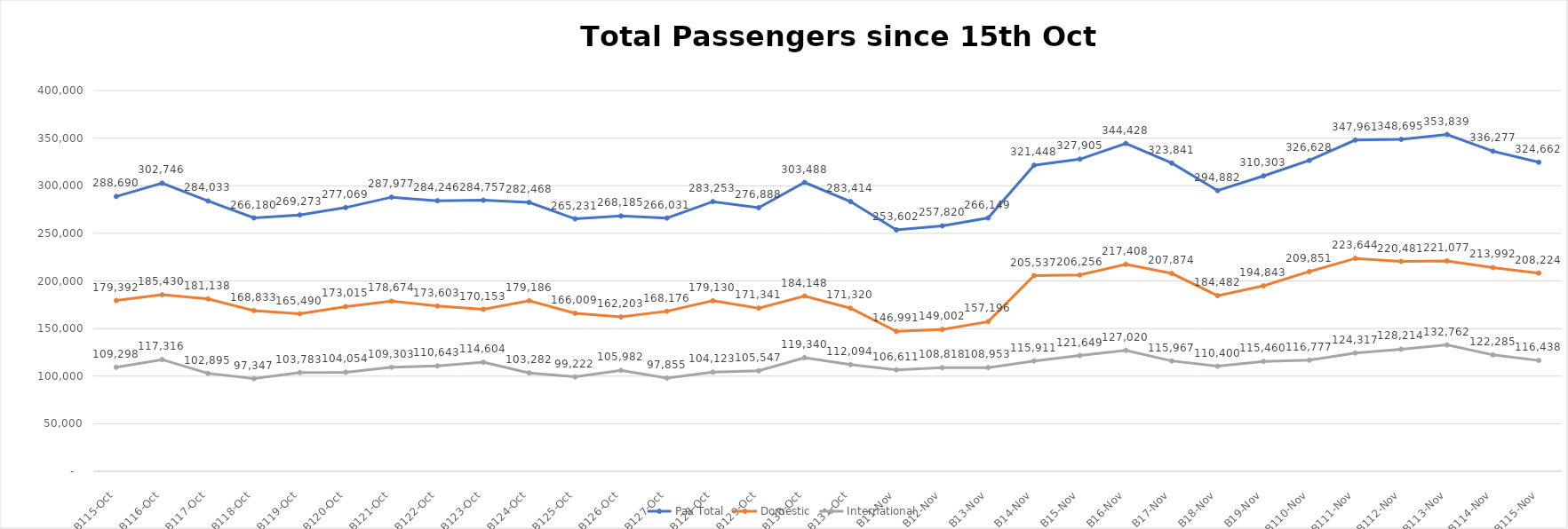
| Category | Pax Total |  Domestic  |  International  |
|---|---|---|---|
| 2022-10-15 | 288690 | 179392 | 109298 |
| 2022-10-16 | 302746 | 185430 | 117316 |
| 2022-10-17 | 284033 | 181138 | 102895 |
| 2022-10-18 | 266180 | 168833 | 97347 |
| 2022-10-19 | 269273 | 165490 | 103783 |
| 2022-10-20 | 277069 | 173015 | 104054 |
| 2022-10-21 | 287977 | 178674 | 109303 |
| 2022-10-22 | 284246 | 173603 | 110643 |
| 2022-10-23 | 284757 | 170153 | 114604 |
| 2022-10-24 | 282468 | 179186 | 103282 |
| 2022-10-25 | 265231 | 166009 | 99222 |
| 2022-10-26 | 268185 | 162203 | 105982 |
| 2022-10-27 | 266031 | 168176 | 97855 |
| 2022-10-28 | 283253 | 179130 | 104123 |
| 2022-10-29 | 276888 | 171341 | 105547 |
| 2022-10-30 | 303488 | 184148 | 119340 |
| 2022-10-31 | 283414 | 171320 | 112094 |
| 2022-11-01 | 253602 | 146991 | 106611 |
| 2022-11-02 | 257820 | 149002 | 108818 |
| 2022-11-03 | 266149 | 157196 | 108953 |
| 2022-11-04 | 321448 | 205537 | 115911 |
| 2022-11-05 | 327905 | 206256 | 121649 |
| 2022-11-06 | 344428 | 217408 | 127020 |
| 2022-11-07 | 323841 | 207874 | 115967 |
| 2022-11-08 | 294882 | 184482 | 110400 |
| 2022-11-09 | 310303 | 194843 | 115460 |
| 2022-11-10 | 326628 | 209851 | 116777 |
| 2022-11-11 | 347961 | 223644 | 124317 |
| 2022-11-12 | 348695 | 220481 | 128214 |
| 2022-11-13 | 353839 | 221077 | 132762 |
| 2022-11-14 | 336277 | 213992 | 122285 |
| 2022-11-15 | 324662 | 208224 | 116438 |